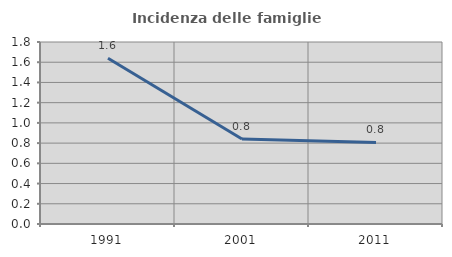
| Category | Incidenza delle famiglie numerose |
|---|---|
| 1991.0 | 1.639 |
| 2001.0 | 0.84 |
| 2011.0 | 0.806 |